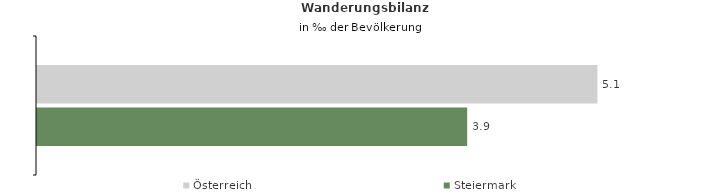
| Category | Österreich | Steiermark |
|---|---|---|
| Wanderungsrate in ‰ der Bevölkerung, Periode 2016-2020 | 5.087 | 3.905 |